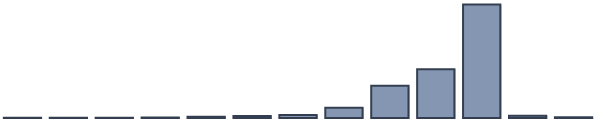
| Category | Series 0 |
|---|---|
| 0 | 0.1 |
| 1 | 0.1 |
| 2 | 0.1 |
| 3 | 0.2 |
| 4 | 0.6 |
| 5 | 0.9 |
| 6 | 1.4 |
| 7 | 4.8 |
| 8 | 15 |
| 9 | 22.7 |
| 10 | 52.9 |
| 11 | 1 |
| 12 | 0.3 |